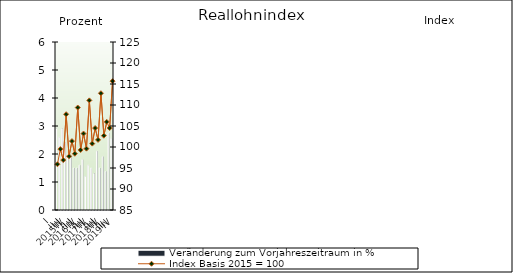
| Category | Veränderung zum Vorjahreszeitraum in % |
|---|---|
| 0 | 2.9 |
| 1 | 2.6 |
| 2 | 2.9 |
| 3 | 2.4 |
| 4 | 2 |
| 5 | 1.9 |
| 6 | 1.5 |
| 7 | 1.5 |
| 8 | 1.6 |
| 9 | 1.8 |
| 10 | 1.2 |
| 11 | 1.6 |
| 12 | 1.5 |
| 13 | 1.3 |
| 14 | 2.1 |
| 15 | 1.5 |
| 16 | 1.903 |
| 17 | 1.377 |
| 18 | 2.751 |
| 19 | 2.55 |